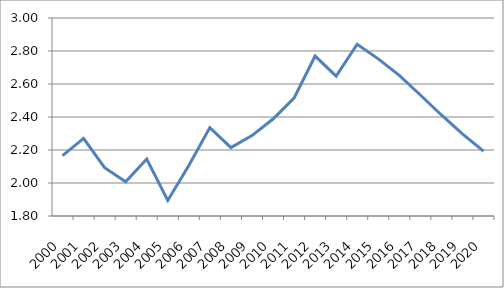
| Category | Offentlig investeringer |
|---|---|
| 2000-01-01 | 2.166 |
| 2001-01-01 | 2.27 |
| 2002-01-01 | 2.093 |
| 2003-01-01 | 2.008 |
| 2004-01-01 | 2.145 |
| 2005-01-01 | 1.894 |
| 2006-01-01 | 2.106 |
| 2007-01-01 | 2.336 |
| 2008-01-01 | 2.215 |
| 2009-01-01 | 2.287 |
| 2010-01-01 | 2.388 |
| 2011-01-01 | 2.515 |
| 2012-01-01 | 2.769 |
| 2013-01-01 | 2.648 |
| 2014-01-01 | 2.841 |
| 2015-01-01 | 2.752 |
| 2016-01-01 | 2.652 |
| 2017-01-01 | 2.533 |
| 2018-01-01 | 2.412 |
| 2019-01-01 | 2.297 |
| 2020-01-01 | 2.193 |